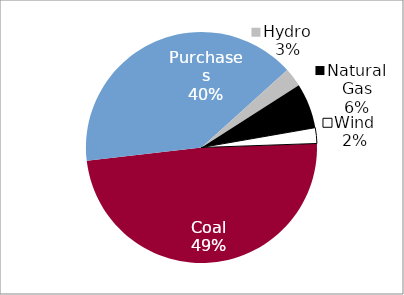
| Category | 2014 Test Year MWH Sources |
|---|---|
| Coal | 0.487 |
| Purchases | 0.401 |
| Hydro | 0.026 |
| Natural Gas | 0.063 |
| Wind | 0.022 |